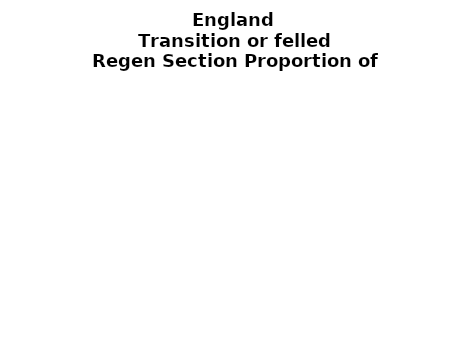
| Category | Transition or felled |
|---|---|
| None | 0.175 |
| Seedlings only | 0.007 |
| Seedlings, saplings only | 0.174 |
| Seedlings, saplings, <7 cm trees | 0.023 |
| Saplings only | 0.482 |
| <7 cm trees, seedlings only | 0 |
| <7 cm trees, saplings only | 0.094 |
| <7 cm Trees only | 0.045 |